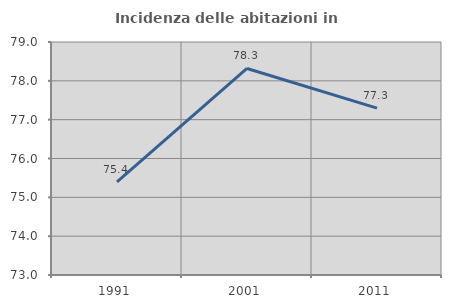
| Category | Incidenza delle abitazioni in proprietà  |
|---|---|
| 1991.0 | 75.396 |
| 2001.0 | 78.318 |
| 2011.0 | 77.297 |